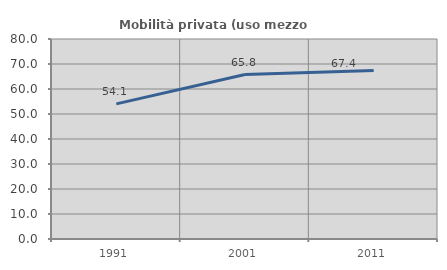
| Category | Mobilità privata (uso mezzo privato) |
|---|---|
| 1991.0 | 54.057 |
| 2001.0 | 65.79 |
| 2011.0 | 67.442 |